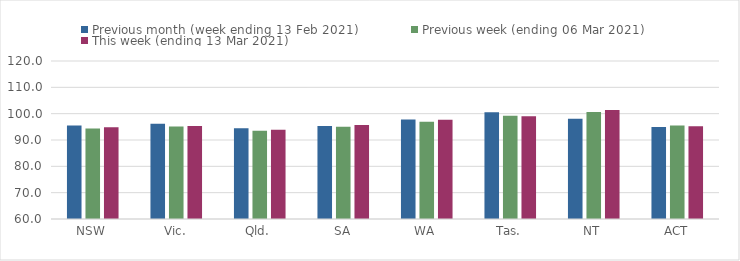
| Category | Previous month (week ending 13 Feb 2021) | Previous week (ending 06 Mar 2021) | This week (ending 13 Mar 2021) |
|---|---|---|---|
| NSW | 95.5 | 94.32 | 94.85 |
| Vic. | 96.17 | 95.1 | 95.33 |
| Qld. | 94.46 | 93.54 | 93.87 |
| SA | 95.29 | 94.99 | 95.65 |
| WA | 97.74 | 96.94 | 97.7 |
| Tas. | 100.55 | 99.17 | 99.04 |
| NT | 98.07 | 100.61 | 101.35 |
| ACT | 94.95 | 95.5 | 95.25 |